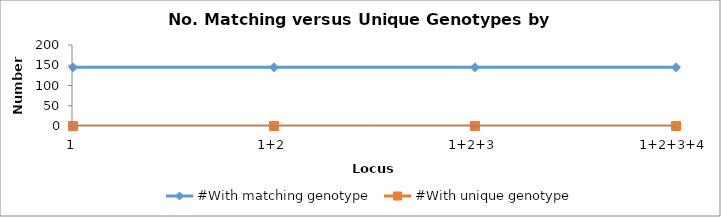
| Category | #With matching genotype | #With unique genotype |
|---|---|---|
| 1 | 145 | 0 |
| 1+2 | 145 | 0 |
| 1+2+3 | 145 | 0 |
| 1+2+3+4 | 145 | 0 |